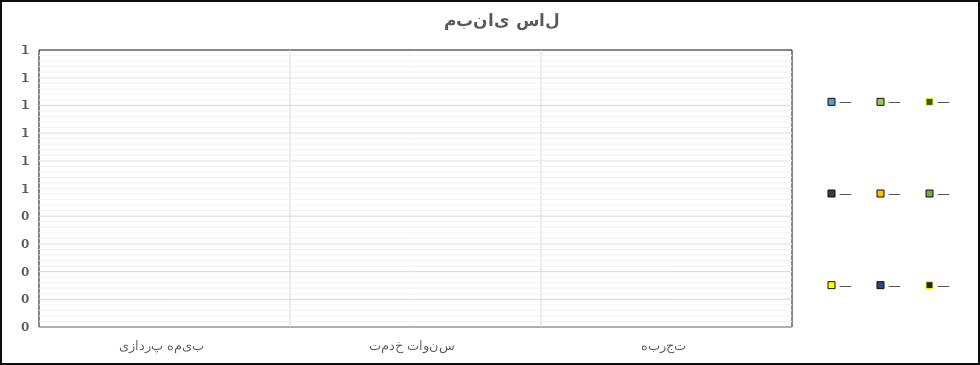
| Category | — |
|---|---|
| بیمه پردازی | 0 |
| سنوات خدمت | 0 |
| تجربه | 0 |